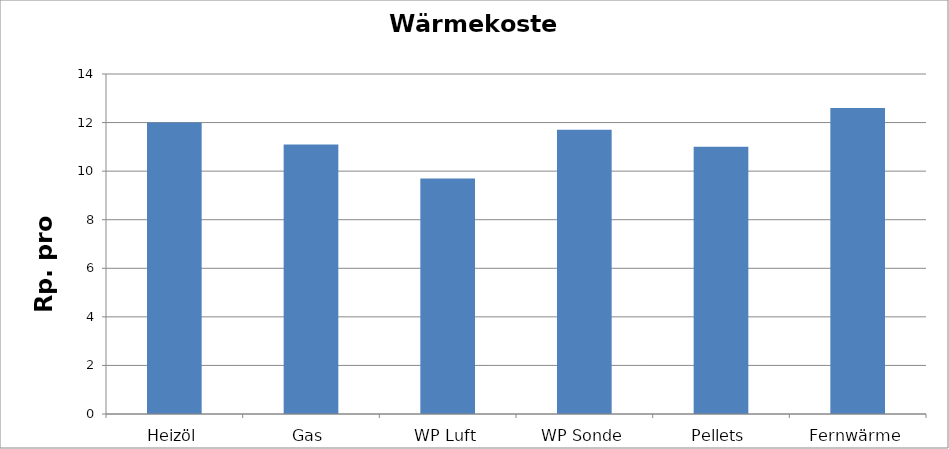
| Category | Wärmekosten [Rp./kWh] |
|---|---|
| Heizöl | 12 |
| Gas | 11.1 |
| WP Luft | 9.7 |
| WP Sonde | 11.7 |
| Pellets | 11 |
| Fernwärme | 12.6 |